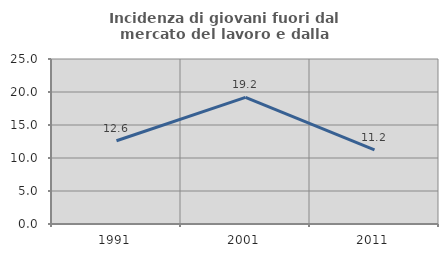
| Category | Incidenza di giovani fuori dal mercato del lavoro e dalla formazione  |
|---|---|
| 1991.0 | 12.609 |
| 2001.0 | 19.192 |
| 2011.0 | 11.236 |